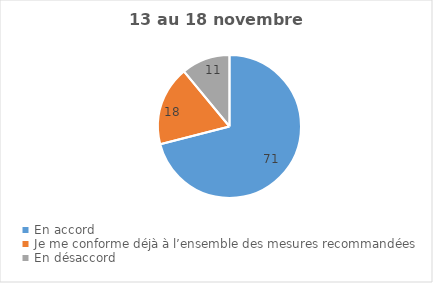
| Category | Series 0 |
|---|---|
| En accord | 71 |
| Je me conforme déjà à l’ensemble des mesures recommandées | 18 |
| En désaccord | 11 |